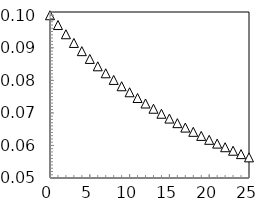
| Category | Series 2 |
|---|---|
| 0.0 | 0.1 |
| 1.0 | 0.097 |
| 2.0 | 0.094 |
| 3.0 | 0.091 |
| 4.0 | 0.089 |
| 5.0 | 0.087 |
| 6.0 | 0.084 |
| 7.0 | 0.082 |
| 8.0 | 0.08 |
| 9.0 | 0.078 |
| 10.0 | 0.076 |
| 11.0 | 0.075 |
| 12.0 | 0.073 |
| 13.0 | 0.071 |
| 14.0 | 0.07 |
| 15.0 | 0.068 |
| 16.0 | 0.067 |
| 17.0 | 0.065 |
| 18.0 | 0.064 |
| 19.0 | 0.063 |
| 20.0 | 0.062 |
| 21.0 | 0.061 |
| 22.0 | 0.059 |
| 23.0 | 0.058 |
| 24.0 | 0.057 |
| 25.0 | 0.056 |